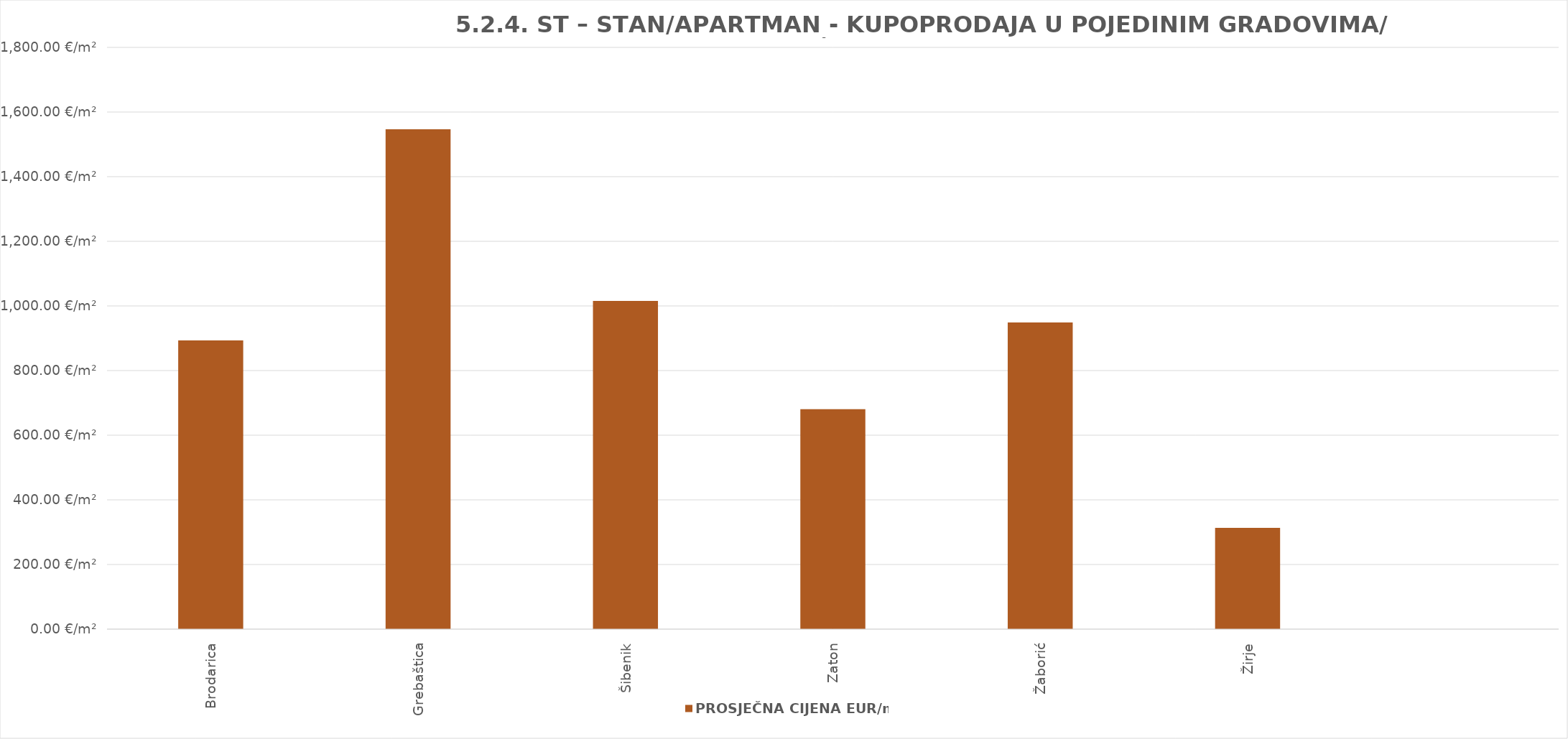
| Category | PROSJEČNA CIJENA EUR/m² |
|---|---|
| Brodarica | 1902-06-11 04:52:52 |
| Grebaštica | 1904-03-25 14:31:40 |
| Šibenik | 1902-10-11 07:13:23 |
| Zaton | 1901-11-10 13:48:09 |
| Žaborić | 1902-08-05 22:57:50 |
| Žirje | 1900-11-08 14:15:31 |